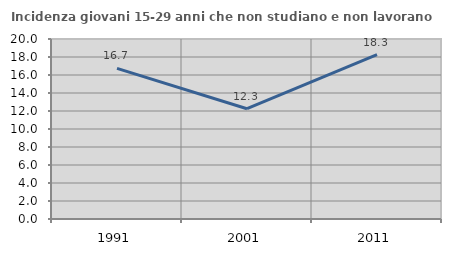
| Category | Incidenza giovani 15-29 anni che non studiano e non lavorano  |
|---|---|
| 1991.0 | 16.74 |
| 2001.0 | 12.253 |
| 2011.0 | 18.265 |